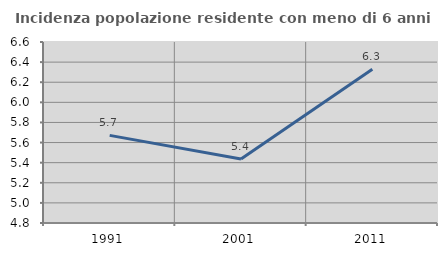
| Category | Incidenza popolazione residente con meno di 6 anni |
|---|---|
| 1991.0 | 5.671 |
| 2001.0 | 5.437 |
| 2011.0 | 6.33 |